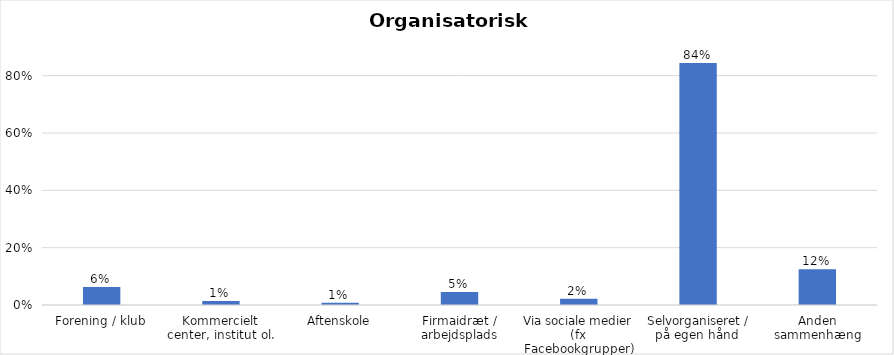
| Category | % |
|---|---|
| Forening / klub | 0.063 |
| Kommercielt center, institut ol. | 0.014 |
| Aftenskole | 0.008 |
| Firmaidræt / arbejdsplads | 0.045 |
| Via sociale medier (fx Facebookgrupper) | 0.022 |
| Selvorganiseret / på egen hånd  | 0.844 |
| Anden sammenhæng | 0.124 |